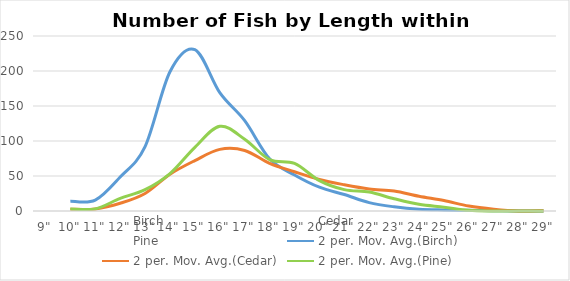
| Category | Birch | Cedar | Pine |
|---|---|---|---|
| 9" | 9 | 1 | 3 |
| 10" | 19 | 4 | 3 |
| 11" | 12 | 2 | 3 |
| 12" | 85 | 20 | 33 |
| 13" | 99 | 30 | 28 |
| 14" | 299 | 75 | 79 |
| 15" | 162 | 69 | 103 |
| 16" | 176 | 107 | 139 |
| 17" | 82 | 66 | 66 |
| 18" | 67 | 70 | 81 |
| 19" | 36 | 42 | 55 |
| 20" | 32 | 48 | 32 |
| 21" | 15 | 27 | 29 |
| 22" | 9 | 36 | 25 |
| 23" | 3 | 21 | 10 |
| 24" | 2 | 21 | 9 |
| 25" | 1 | 9 | 2 |
| 26" | 1 | 5 | 0 |
| 27" | 0 | 0 | 0 |
| 28" | 0 | 0 | 0 |
| 29" | 0 | 1 | 0 |